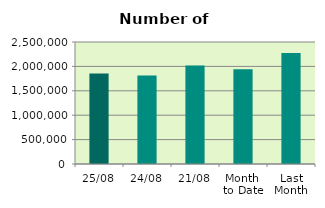
| Category | Series 0 |
|---|---|
| 25/08 | 1852786 |
| 24/08 | 1814684 |
| 21/08 | 2015956 |
| Month 
to Date | 1941453.882 |
| Last
Month | 2275631.565 |